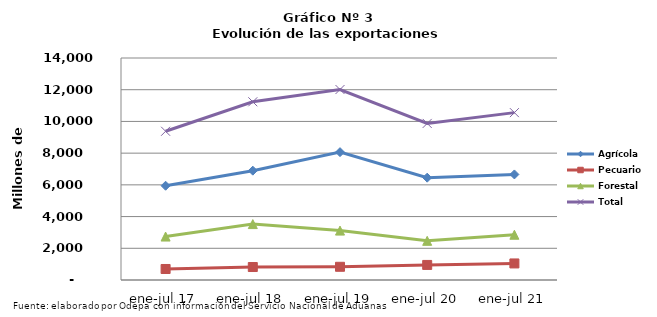
| Category | Agrícola | Pecuario | Forestal | Total |
|---|---|---|---|---|
| ene-jul 17 | 5944387 | 694391 | 2740141 | 9378919 |
| ene-jul 18 | 6895153 | 817867 | 3525647 | 11238667 |
| ene-jul 19 | 8062661 | 833594 | 3115566 | 12011821 |
| ene-jul 20 | 6452983 | 950592 | 2470795 | 9874370 |
| ene-jul 21 | 6656750 | 1043877 | 2854150 | 10554777 |